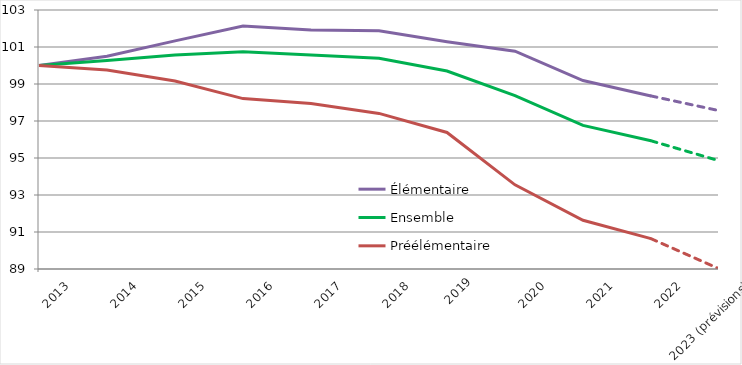
| Category | Élémentaire | Ensemble | Préélémentaire |
|---|---|---|---|
| 2013 | 100 | 100 | 100 |
| 2014 | 100.504 | 100.269 | 99.752 |
| 2015 | 101.331 | 100.574 | 99.161 |
| 2016 | 102.134 | 100.747 | 98.21 |
| 2017 | 101.916 | 100.563 | 97.946 |
| 2018 | 101.875 | 100.388 | 97.41 |
| 2019
 | 101.284 | 99.702 | 96.38 |
| 2020 | 100.774 | 98.371 | 93.549 |
| 2021 | 99.187 | 96.761 | 91.636 |
| 2022 | 98.354 | 95.931 | 90.64 |
| 2023 (prévisions) | 97.561 | 94.853 | 89.014 |